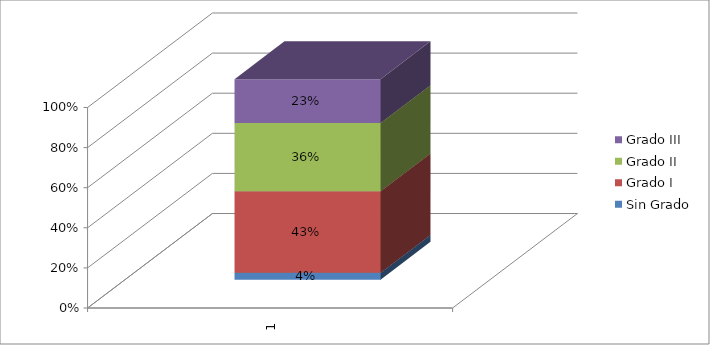
| Category | Sin Grado | Grado I | Grado II | Grado III |
|---|---|---|---|---|
| 0 | 0.036 | 0.43 | 0.359 | 0.232 |